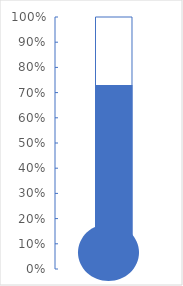
| Category | Achieved |
|---|---|
| 0 | 0.73 |